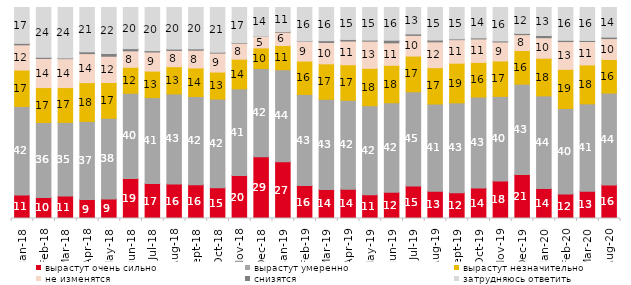
| Category | вырастут очень сильно | вырастут умеренно | вырастут незначительно | не изменятся | снизятся | затрудняюсь ответить |
|---|---|---|---|---|---|---|
| 2018-01-01 | 11.1 | 42 | 17.25 | 11.95 | 0.7 | 17 |
| 2018-02-01 | 10 | 35.5 | 16.55 | 13.8 | 0.55 | 23.6 |
| 2018-03-01 | 10.65 | 34.9 | 16.5 | 13.7 | 0.35 | 23.9 |
| 2018-04-01 | 8.95 | 37.05 | 18.4 | 13.75 | 0.85 | 21 |
| 2018-05-01 | 9.3 | 38.2 | 16.95 | 12.45 | 1.3 | 21.8 |
| 2018-06-01 | 18.95 | 40.4 | 12.3 | 7.8 | 1.05 | 19.5 |
| 2018-07-01 | 16.55 | 40.75 | 12.55 | 9.05 | 0.65 | 20.45 |
| 2018-08-01 | 16.35 | 42.7 | 12.9 | 7.7 | 0.65 | 19.7 |
| 2018-09-01 | 16.05 | 41.75 | 13.55 | 8.4 | 0.65 | 19.6 |
| 2018-10-01 | 14.6 | 42 | 12.8 | 9 | 0.4 | 21.2 |
| 2018-11-01 | 20.359 | 41.068 | 14.072 | 7.585 | 0.25 | 16.667 |
| 2018-12-01 | 29.25 | 41.8 | 9.8 | 5.4 | 0.1 | 13.65 |
| 2019-01-01 | 26.85 | 43.65 | 11.45 | 6.35 | 0.3 | 11.4 |
| 2019-02-01 | 15.6 | 43.2 | 15.8 | 9.35 | 0.15 | 15.9 |
| 2019-03-01 | 13.774 | 42.715 | 16.808 | 10.144 | 0.845 | 15.714 |
| 2019-04-01 | 13.911 | 42.129 | 16.832 | 11.238 | 0.743 | 15.149 |
| 2019-05-01 | 11.293 | 42.15 | 17.732 | 12.878 | 0.495 | 15.453 |
| 2019-06-01 | 12.419 | 42.444 | 17.756 | 10.623 | 1.247 | 15.511 |
| 2019-07-01 | 15.396 | 44.653 | 16.931 | 9.802 | 0.693 | 12.525 |
| 2019-08-01 | 12.887 | 41.359 | 17.233 | 12.238 | 0.849 | 15.435 |
| 2019-09-01 | 12.228 | 42.574 | 18.812 | 11.139 | 0.347 | 14.901 |
| 2019-10-01 | 14.455 | 43.119 | 16.386 | 11.139 | 0.495 | 14.406 |
| 2019-11-01 | 17.772 | 40.099 | 16.782 | 9.01 | 0.495 | 15.842 |
| 2019-12-01 | 20.891 | 42.772 | 15.941 | 7.525 | 0.594 | 12.277 |
| 2020-01-01 | 14.208 | 43.911 | 17.822 | 9.752 | 1.04 | 13.267 |
| 2020-02-01 | 11.634 | 40.495 | 18.564 | 13.168 | 0.594 | 15.545 |
| 2020-03-01 | 12.94 | 41.398 | 18.443 | 11.106 | 0.496 | 15.617 |
| 2020-08-01 | 15.839 | 43.595 | 15.938 | 9.881 | 0.695 | 14.052 |